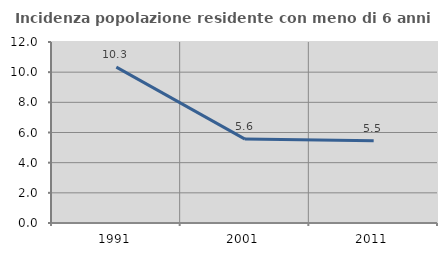
| Category | Incidenza popolazione residente con meno di 6 anni |
|---|---|
| 1991.0 | 10.334 |
| 2001.0 | 5.564 |
| 2011.0 | 5.453 |